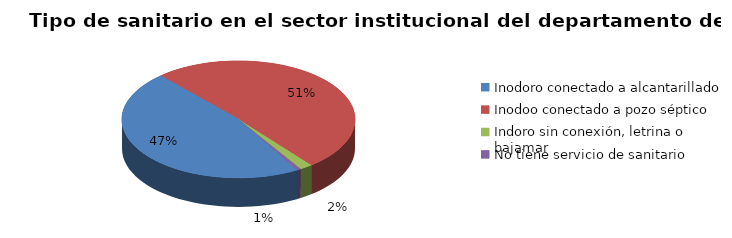
| Category | Series 0 |
|---|---|
| Inodoro conectado a alcantarillado | 0.467 |
| Inodoo conectado a pozo séptico | 0.509 |
| Indoro sin conexión, letrina o bajamar | 0.018 |
| No tiene servicio de sanitario | 0.006 |